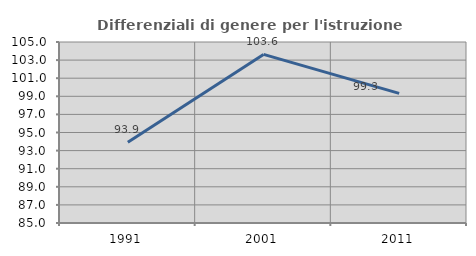
| Category | Differenziali di genere per l'istruzione superiore |
|---|---|
| 1991.0 | 93.921 |
| 2001.0 | 103.629 |
| 2011.0 | 99.318 |